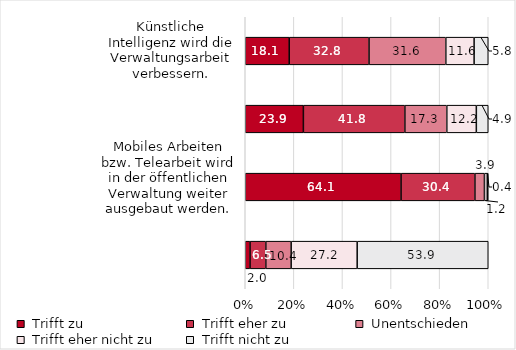
| Category | Series 0 | Series 1 | Series 2 | Series 3 | Series 4 |
|---|---|---|---|---|---|
| Künstliche Intelligenz wird die Verwaltungsarbeit verbessern. | 18.087 | 32.848 | 31.601 | 11.642 | 5.821 |
| Im Zuge der Digitalisierung werden die Anforderungen an meinen Beruf zunehmen. | 23.922 | 41.765 | 17.255 | 12.157 | 4.902 |
| Mobiles Arbeiten bzw. Telearbeit wird in der öffentlichen Verwaltung weiter ausgebaut werden. | 64.118 | 30.392 | 3.922 | 1.176 | 0.392 |
| Ich mache mir Sorgen, dass die Digitalisierung meinen Beruf soweit verändert, dass ich den Anforderungen nicht mehr gewachsen bin. | 1.969 | 6.496 | 10.433 | 27.165 | 53.937 |